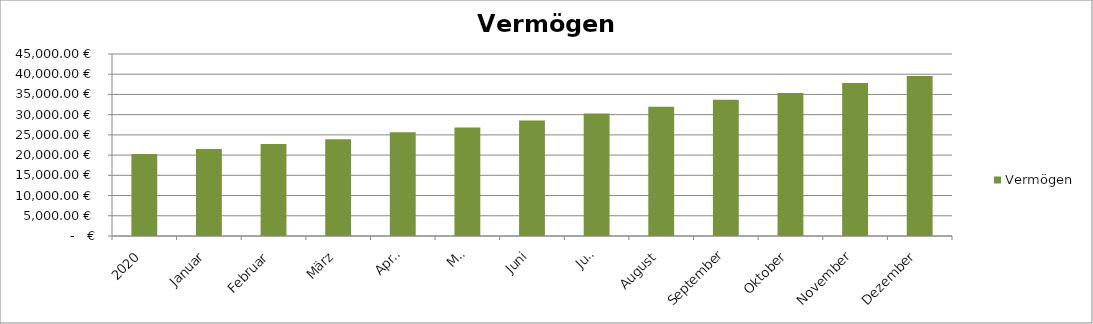
| Category | Vermögen |
|---|---|
| 2020 | 20300 |
| Januar | 21522.52 |
| Februar | 22725.04 |
| März | 23927.56 |
| April | 25636.08 |
| Mai | 26844.6 |
| Juni | 28553.12 |
| Juli | 30261.64 |
| August | 31970.16 |
| September | 33678.68 |
| Oktober | 35387.2 |
| November | 37845.72 |
| Dezember | 39554.24 |